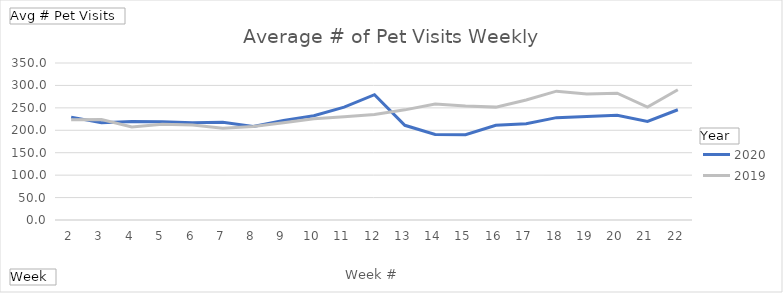
| Category | 2020 | 2019 |
|---|---|---|
| 2 | 229.378 | 223.554 |
| 3 | 217.068 | 223.811 |
| 4 | 219.392 | 207.27 |
| 5 | 219.23 | 213.338 |
| 6 | 216.716 | 211.595 |
| 7 | 217.851 | 204.459 |
| 8 | 208.351 | 208.365 |
| 9 | 221.743 | 216.919 |
| 10 | 232.378 | 225.757 |
| 11 | 251.473 | 230.432 |
| 12 | 279.419 | 235.041 |
| 13 | 211.095 | 245.554 |
| 14 | 190.595 | 258.595 |
| 15 | 189.986 | 254.162 |
| 16 | 211.122 | 251.635 |
| 17 | 214.378 | 267.514 |
| 18 | 228.162 | 287.243 |
| 19 | 230.527 | 280.865 |
| 20 | 233.662 | 282.662 |
| 21 | 219.824 | 251.743 |
| 22 | 245.795 | 290.514 |